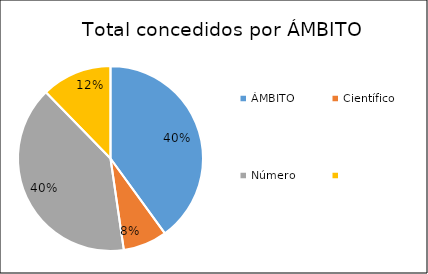
| Category | Total xeral |
|---|---|
| 0 | 26 |
| 1 | 5 |
| 2 | 26 |
| 3 | 8 |